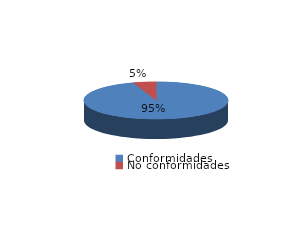
| Category | Series 0 |
|---|---|
| Conformidades | 788 |
| No conformidades | 42 |